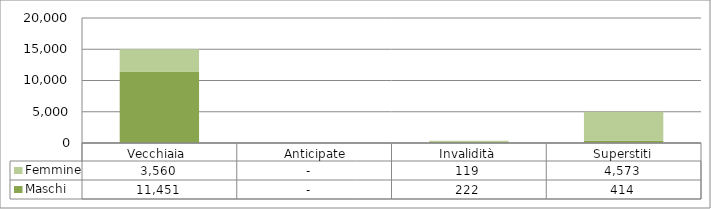
| Category | Maschi | Femmine |
|---|---|---|
| Vecchiaia  | 11451 | 3560 |
|  Anticipate | 0 | 0 |
| Invalidità | 222 | 119 |
| Superstiti | 414 | 4573 |